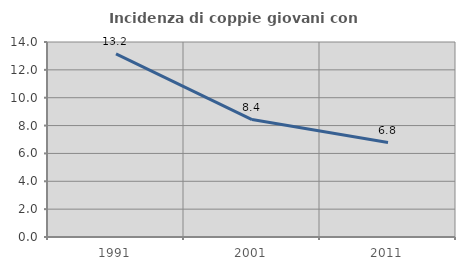
| Category | Incidenza di coppie giovani con figli |
|---|---|
| 1991.0 | 13.152 |
| 2001.0 | 8.429 |
| 2011.0 | 6.783 |